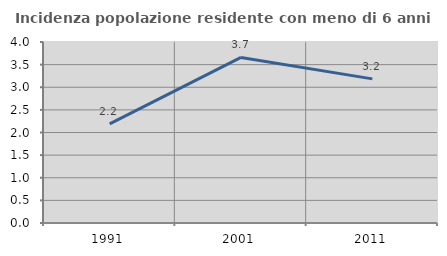
| Category | Incidenza popolazione residente con meno di 6 anni |
|---|---|
| 1991.0 | 2.191 |
| 2001.0 | 3.659 |
| 2011.0 | 3.185 |